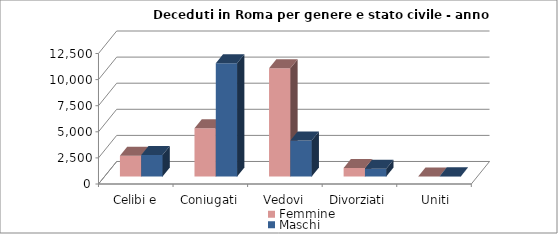
| Category | Femmine | Maschi |
|---|---|---|
| Celibi e nubili | 1993 | 2064 |
| Coniugati | 4627 | 10837 |
| Vedovi | 10368 | 3449 |
| Divorziati | 826 | 740 |
| Uniti Civilmente | 4 | 12 |